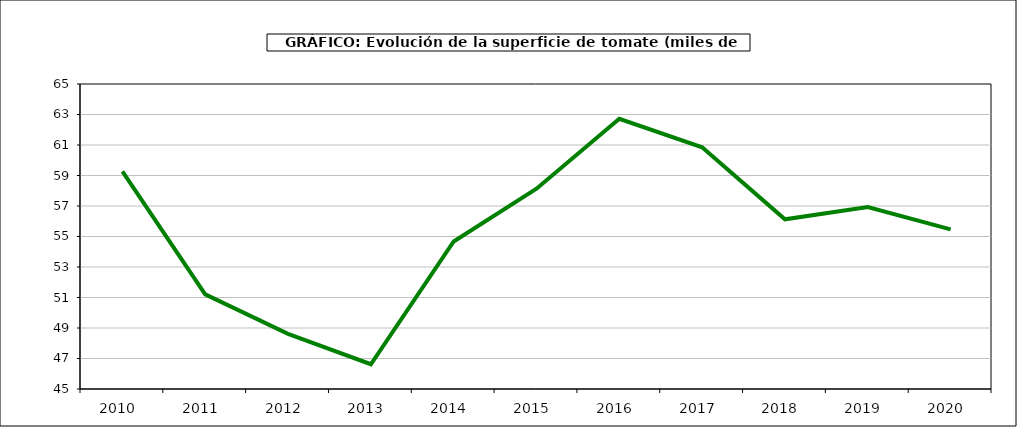
| Category | superficie |
|---|---|
| 2010.0 | 59.267 |
| 2011.0 | 51.204 |
| 2012.0 | 48.617 |
| 2013.0 | 46.623 |
| 2014.0 | 54.675 |
| 2015.0 | 58.134 |
| 2016.0 | 62.715 |
| 2017.0 | 60.852 |
| 2018.0 | 56.128 |
| 2019.0 | 56.937 |
| 2020.0 | 55.468 |